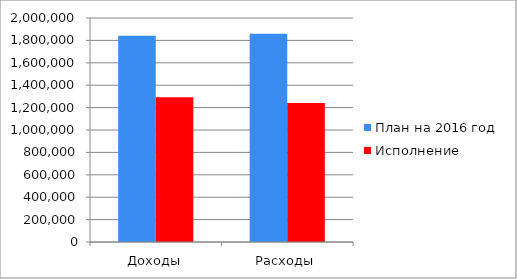
| Category | План на 2016 год | Исполнение |
|---|---|---|
| Доходы | 1841570 | 1293307 |
| Расходы | 1858826 | 1240620 |